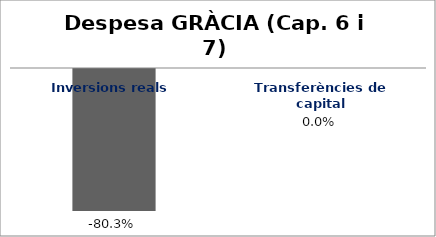
| Category | Series 0 |
|---|---|
| Inversions reals | -0.803 |
| Transferències de capital | 0 |